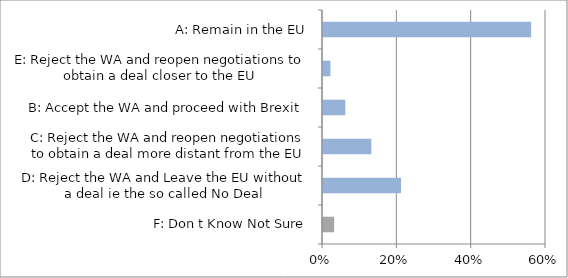
| Category | Share |
|---|---|
| F: Don t Know Not Sure | 0.03 |
| D: Reject the WA and Leave the EU without a deal ie the so called No Deal | 0.21 |
| C: Reject the WA and reopen negotiations to obtain a deal more distant from the EU | 0.13 |
| B: Accept the WA and proceed with Brexit | 0.06 |
| E: Reject the WA and reopen negotiations to obtain a deal closer to the EU | 0.02 |
| A: Remain in the EU | 0.56 |